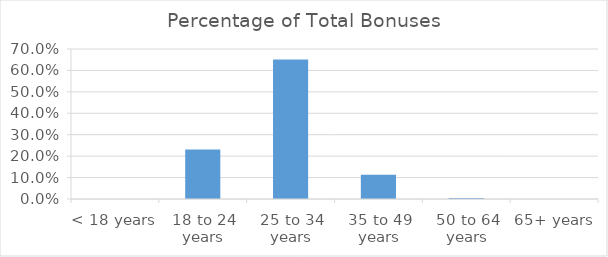
| Category | Percentage of Total Bonuses (%) |
|---|---|
| < 18 years | 0 |
| 18 to 24 years | 0.231 |
| 25 to 34 years | 0.651 |
| 35 to 49 years | 0.113 |
| 50 to 64 years | 0.005 |
| 65+ years | 0 |